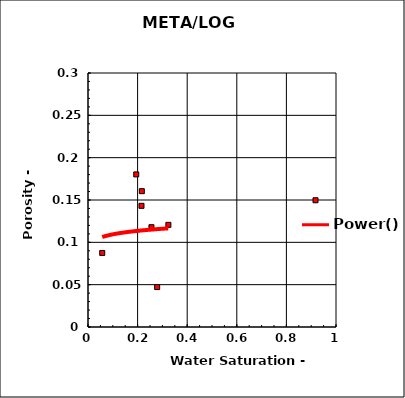
| Category | Series 0 |
|---|---|
| 0.05733940131181198 | 0.087 |
| 0.27890528142899207 | 0.047 |
| 0.2557854212242092 | 0.118 |
| 0.2156706045529504 | 0.143 |
| 0.19453581027162084 | 0.18 |
| 0.2170801678103901 | 0.16 |
| 0.3241136078870042 | 0.121 |